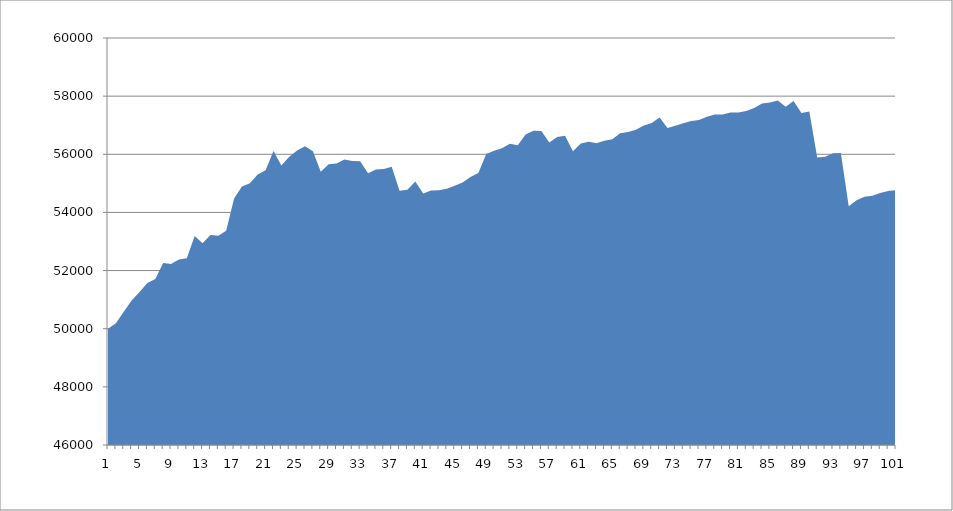
| Category | Series 0 |
|---|---|
| 0 | 50000 |
| 1 | 50185.185 |
| 2 | 50585.185 |
| 3 | 50973.977 |
| 4 | 51265.977 |
| 5 | 51576.741 |
| 6 | 51711.523 |
| 7 | 52262.893 |
| 8 | 52230.24 |
| 9 | 52381.556 |
| 10 | 52425.915 |
| 11 | 53192.581 |
| 12 | 52939.146 |
| 13 | 53220.069 |
| 14 | 53197.341 |
| 15 | 53369.61 |
| 16 | 54480.721 |
| 17 | 54888.365 |
| 18 | 55001.902 |
| 19 | 55308.308 |
| 20 | 55448.308 |
| 21 | 56110.305 |
| 22 | 55610.305 |
| 23 | 55916.954 |
| 24 | 56129.798 |
| 25 | 56279.798 |
| 26 | 56105.301 |
| 27 | 55401.645 |
| 28 | 55657.201 |
| 29 | 55686.925 |
| 30 | 55823.001 |
| 31 | 55769.596 |
| 32 | 55759.375 |
| 33 | 55350.284 |
| 34 | 55480.284 |
| 35 | 55492.498 |
| 36 | 55570.42 |
| 37 | 54746.89 |
| 38 | 54783.7 |
| 39 | 55066.459 |
| 40 | 54651.074 |
| 41 | 54754.078 |
| 42 | 54760.213 |
| 43 | 54816.924 |
| 44 | 54917.296 |
| 45 | 55025.73 |
| 46 | 55220.535 |
| 47 | 55353.465 |
| 48 | 56009.309 |
| 49 | 56118.959 |
| 50 | 56205.212 |
| 51 | 56362.876 |
| 52 | 56307.394 |
| 53 | 56678.935 |
| 54 | 56813.264 |
| 55 | 56799.502 |
| 56 | 56409.112 |
| 57 | 56596.44 |
| 58 | 56640.493 |
| 59 | 56102.227 |
| 60 | 56370.449 |
| 61 | 56434.248 |
| 62 | 56376.841 |
| 63 | 56464.524 |
| 64 | 56518.022 |
| 65 | 56724.747 |
| 66 | 56770.361 |
| 67 | 56848.099 |
| 68 | 56992.896 |
| 69 | 57073.571 |
| 70 | 57266.481 |
| 71 | 56908.016 |
| 72 | 56984.939 |
| 73 | 57069.276 |
| 74 | 57147.627 |
| 75 | 57179.83 |
| 76 | 57291.17 |
| 77 | 57366.35 |
| 78 | 57371.599 |
| 79 | 57439.215 |
| 80 | 57440.895 |
| 81 | 57490.895 |
| 82 | 57593.679 |
| 83 | 57746.643 |
| 84 | 57785.413 |
| 85 | 57849.748 |
| 86 | 57639.346 |
| 87 | 57828.82 |
| 88 | 57417.055 |
| 89 | 57471.335 |
| 90 | 55888.376 |
| 91 | 55913.907 |
| 92 | 56031.989 |
| 93 | 56044.711 |
| 94 | 54210.631 |
| 95 | 54422.612 |
| 96 | 54536.647 |
| 97 | 54575.903 |
| 98 | 54670.229 |
| 99 | 54737.367 |
| 100 | 54762.386 |